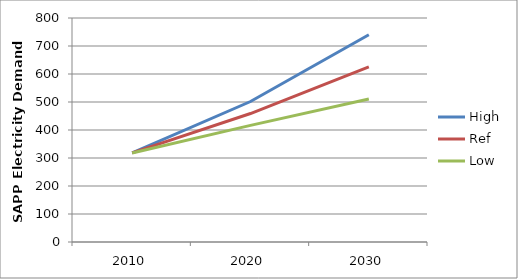
| Category | High | Ref | Low |
|---|---|---|---|
| 2010.0 | 318.12 | 318.12 | 318.12 |
| 2020.0 | 501.761 | 458.852 | 416.456 |
| 2030.0 | 740.057 | 625.156 | 510.826 |